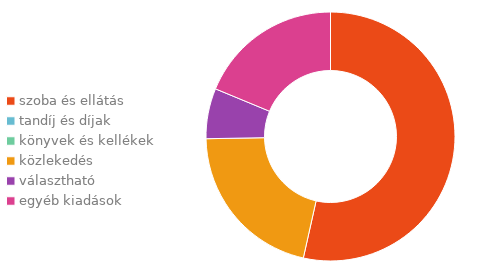
| Category | Series 0 |
|---|---|
| szoba és ellátás | 0.253 |
| tandíj és díjak | 0.336 |
| könyvek és kellékek | 0.146 |
| közlekedés | 0.078 |
| választható | 0.076 |
| egyéb kiadások | 0.112 |